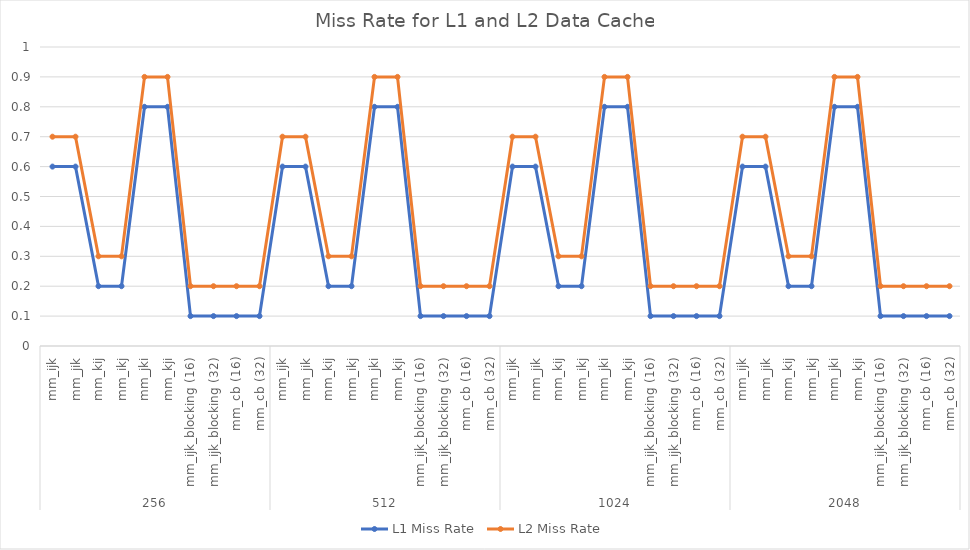
| Category | L1 Miss Rate | L2 Miss Rate |
|---|---|---|
| 0 | 0.6 | 0.7 |
| 1 | 0.6 | 0.7 |
| 2 | 0.2 | 0.3 |
| 3 | 0.2 | 0.3 |
| 4 | 0.8 | 0.9 |
| 5 | 0.8 | 0.9 |
| 6 | 0.1 | 0.2 |
| 7 | 0.1 | 0.2 |
| 8 | 0.1 | 0.2 |
| 9 | 0.1 | 0.2 |
| 10 | 0.6 | 0.7 |
| 11 | 0.6 | 0.7 |
| 12 | 0.2 | 0.3 |
| 13 | 0.2 | 0.3 |
| 14 | 0.8 | 0.9 |
| 15 | 0.8 | 0.9 |
| 16 | 0.1 | 0.2 |
| 17 | 0.1 | 0.2 |
| 18 | 0.1 | 0.2 |
| 19 | 0.1 | 0.2 |
| 20 | 0.6 | 0.7 |
| 21 | 0.6 | 0.7 |
| 22 | 0.2 | 0.3 |
| 23 | 0.2 | 0.3 |
| 24 | 0.8 | 0.9 |
| 25 | 0.8 | 0.9 |
| 26 | 0.1 | 0.2 |
| 27 | 0.1 | 0.2 |
| 28 | 0.1 | 0.2 |
| 29 | 0.1 | 0.2 |
| 30 | 0.6 | 0.7 |
| 31 | 0.6 | 0.7 |
| 32 | 0.2 | 0.3 |
| 33 | 0.2 | 0.3 |
| 34 | 0.8 | 0.9 |
| 35 | 0.8 | 0.9 |
| 36 | 0.1 | 0.2 |
| 37 | 0.1 | 0.2 |
| 38 | 0.1 | 0.2 |
| 39 | 0.1 | 0.2 |